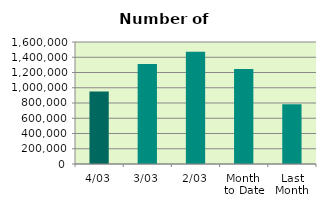
| Category | Series 0 |
|---|---|
| 4/03 | 951780 |
| 3/03 | 1311298 |
| 2/03 | 1471698 |
| Month 
to Date | 1244925.333 |
| Last
Month | 783511.9 |